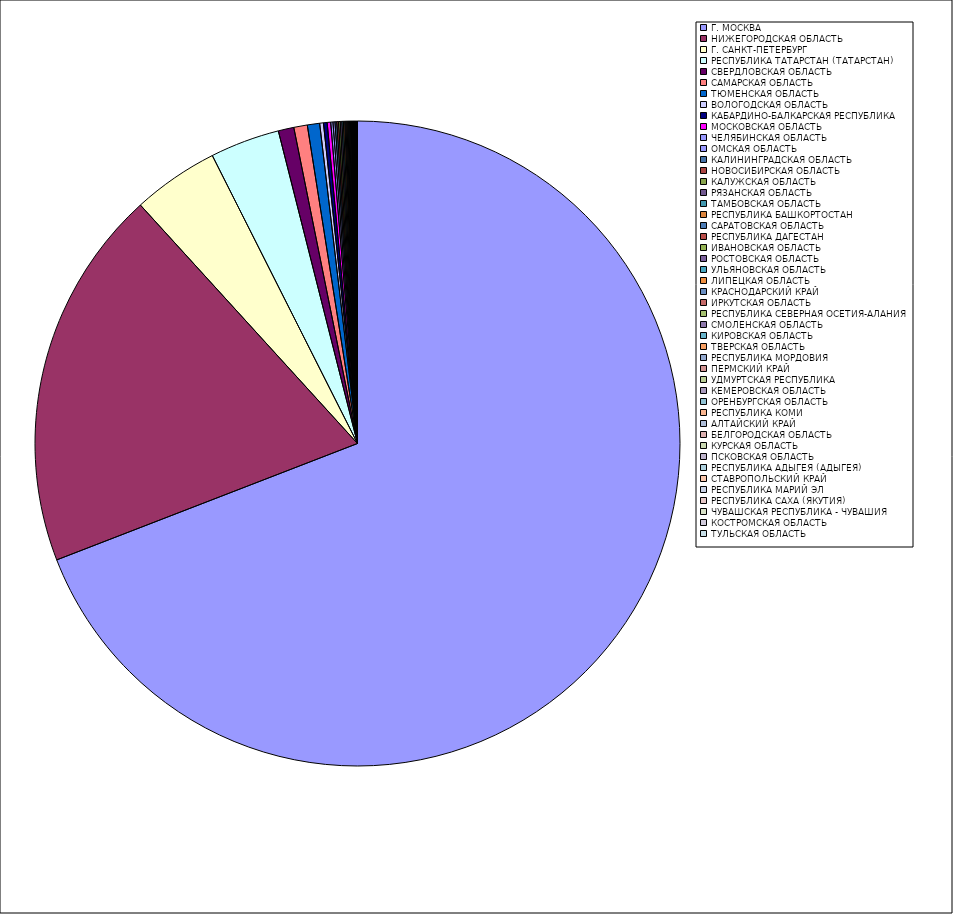
| Category | Оборот |
|---|---|
| Г. МОСКВА | 69.096 |
| НИЖЕГОРОДСКАЯ ОБЛАСТЬ | 19.115 |
| Г. САНКТ-ПЕТЕРБУРГ | 4.321 |
| РЕСПУБЛИКА ТАТАРСТАН (ТАТАРСТАН) | 3.483 |
| СВЕРДЛОВСКАЯ ОБЛАСТЬ | 0.782 |
| САМАРСКАЯ ОБЛАСТЬ | 0.676 |
| ТЮМЕНСКАЯ ОБЛАСТЬ | 0.615 |
| ВОЛОГОДСКАЯ ОБЛАСТЬ | 0.189 |
| КАБАРДИНО-БАЛКАРСКАЯ РЕСПУБЛИКА | 0.184 |
| МОСКОВСКАЯ ОБЛАСТЬ | 0.176 |
| ЧЕЛЯБИНСКАЯ ОБЛАСТЬ | 0.113 |
| ОМСКАЯ ОБЛАСТЬ | 0.099 |
| КАЛИНИНГРАДСКАЯ ОБЛАСТЬ | 0.088 |
| НОВОСИБИРСКАЯ ОБЛАСТЬ | 0.087 |
| КАЛУЖСКАЯ ОБЛАСТЬ | 0.085 |
| РЯЗАНСКАЯ ОБЛАСТЬ | 0.082 |
| ТАМБОВСКАЯ ОБЛАСТЬ | 0.072 |
| РЕСПУБЛИКА БАШКОРТОСТАН | 0.07 |
| САРАТОВСКАЯ ОБЛАСТЬ | 0.053 |
| РЕСПУБЛИКА ДАГЕСТАН | 0.051 |
| ИВАНОВСКАЯ ОБЛАСТЬ | 0.046 |
| РОСТОВСКАЯ ОБЛАСТЬ | 0.045 |
| УЛЬЯНОВСКАЯ ОБЛАСТЬ | 0.045 |
| ЛИПЕЦКАЯ ОБЛАСТЬ | 0.04 |
| КРАСНОДАРСКИЙ КРАЙ | 0.039 |
| ИРКУТСКАЯ ОБЛАСТЬ | 0.027 |
| РЕСПУБЛИКА СЕВЕРНАЯ ОСЕТИЯ-АЛАНИЯ | 0.024 |
| СМОЛЕНСКАЯ ОБЛАСТЬ | 0.023 |
| КИРОВСКАЯ ОБЛАСТЬ | 0.02 |
| ТВЕРСКАЯ ОБЛАСТЬ | 0.019 |
| РЕСПУБЛИКА МОРДОВИЯ | 0.018 |
| ПЕРМСКИЙ КРАЙ | 0.017 |
| УДМУРТСКАЯ РЕСПУБЛИКА | 0.017 |
| КЕМЕРОВСКАЯ ОБЛАСТЬ | 0.016 |
| ОРЕНБУРГСКАЯ ОБЛАСТЬ | 0.016 |
| РЕСПУБЛИКА КОМИ | 0.016 |
| АЛТАЙСКИЙ КРАЙ | 0.012 |
| БЕЛГОРОДСКАЯ ОБЛАСТЬ | 0.012 |
| КУРСКАЯ ОБЛАСТЬ | 0.011 |
| ПСКОВСКАЯ ОБЛАСТЬ | 0.01 |
| РЕСПУБЛИКА АДЫГЕЯ (АДЫГЕЯ) | 0.009 |
| СТАВРОПОЛЬСКИЙ КРАЙ | 0.009 |
| РЕСПУБЛИКА МАРИЙ ЭЛ | 0.008 |
| РЕСПУБЛИКА САХА (ЯКУТИЯ) | 0.008 |
| ЧУВАШСКАЯ РЕСПУБЛИКА - ЧУВАШИЯ | 0.007 |
| КОСТРОМСКАЯ ОБЛАСТЬ | 0.007 |
| ТУЛЬСКАЯ ОБЛАСТЬ | 0.007 |